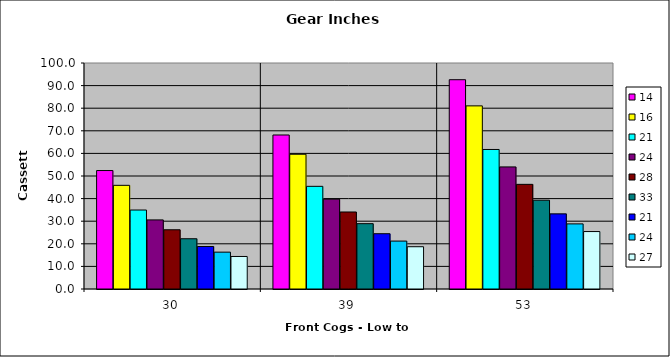
| Category | 14 | 16 | 21 | 24 | 28 | 33 | 27 |
|---|---|---|---|---|---|---|---|
| 30.0 | 52.419 | 45.867 | 18.817 | 16.308 | 26.21 | 22.238 | 14.39 |
| 39.0 | 68.145 | 59.627 | 24.462 | 21.201 | 34.072 | 28.91 | 18.706 |
| 53.0 | 92.607 | 81.031 | 33.244 | 28.811 | 46.304 | 39.288 | 25.422 |